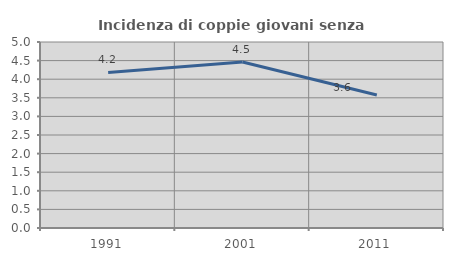
| Category | Incidenza di coppie giovani senza figli |
|---|---|
| 1991.0 | 4.183 |
| 2001.0 | 4.464 |
| 2011.0 | 3.577 |